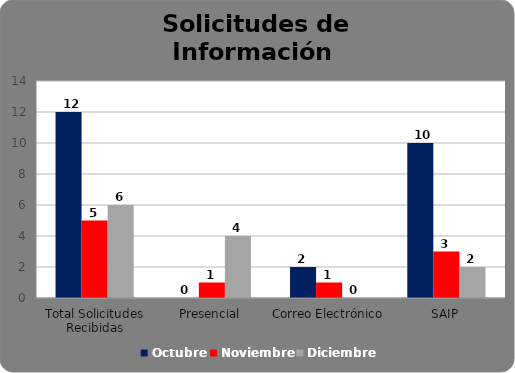
| Category | Octubre | Noviembre | Diciembre |
|---|---|---|---|
| Total Solicitudes Recibidas | 12 | 5 | 6 |
| Presencial | 0 | 1 | 4 |
| Correo Electrónico  | 2 | 1 | 0 |
| SAIP | 10 | 3 | 2 |